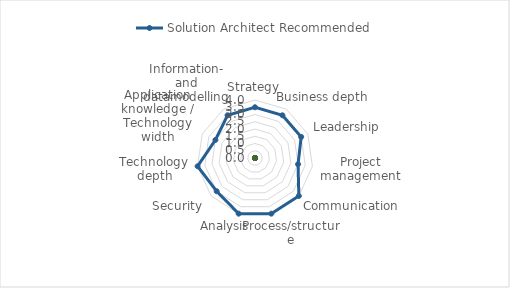
| Category | Solution Architect |
|---|---|
| Strategy |  |
| Business depth |  |
| Leadership |  |
| Project management |  |
| Communication |  |
| Process/structure |  |
| Analysis |  |
| Security |  |
| Technology depth |  |
| Application knowledge / Technology width |  |
| Information- and datamodelling |  |